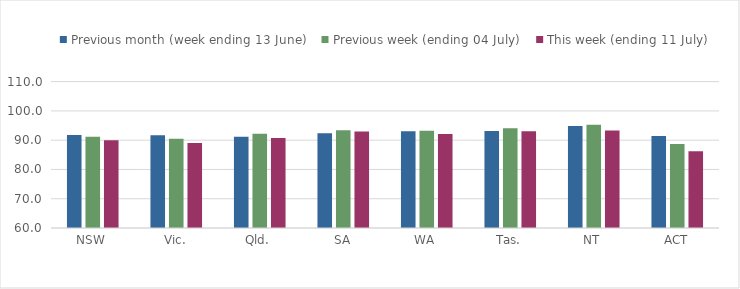
| Category | Previous month (week ending 13 June) | Previous week (ending 04 July) | This week (ending 11 July) |
|---|---|---|---|
| NSW | 91.804 | 91.149 | 89.991 |
| Vic. | 91.7 | 90.447 | 89.025 |
| Qld. | 91.169 | 92.158 | 90.744 |
| SA | 92.337 | 93.404 | 92.988 |
| WA | 93.077 | 93.237 | 92.109 |
| Tas. | 93.131 | 94.047 | 93.067 |
| NT | 94.841 | 95.28 | 93.267 |
| ACT | 91.44 | 88.716 | 86.191 |